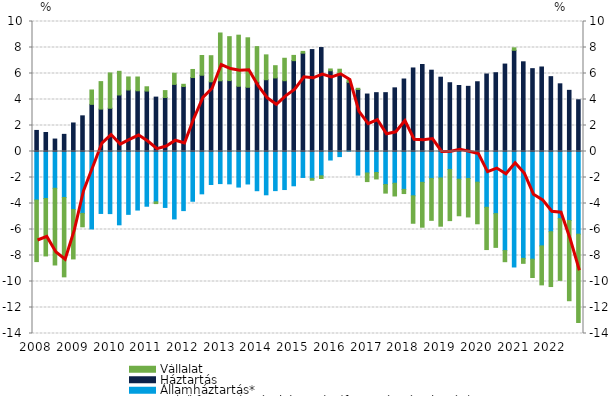
| Category | Államháztartás* | Háztartás | Vállalat |
|---|---|---|---|
| 2008.0 | -3.735 | 1.621 | -4.733 |
| nan | -3.615 | 1.462 | -4.419 |
| nan | -2.831 | 0.957 | -5.899 |
| nan | -3.539 | 1.319 | -6.103 |
| 2009.0 | -4.467 | 2.194 | -3.797 |
| nan | -4.761 | 2.743 | -1.033 |
| nan | -5.958 | 3.627 | 1.105 |
| nan | -4.765 | 3.261 | 2.114 |
| 2010.0 | -4.778 | 3.327 | 2.716 |
| nan | -5.641 | 4.347 | 1.821 |
| nan | -4.835 | 4.73 | 1.004 |
| nan | -4.504 | 4.67 | 1.06 |
| 2011.0 | -4.21 | 4.649 | 0.33 |
| nan | -3.873 | 4.184 | -0.134 |
| nan | -4.302 | 4.155 | 0.529 |
| nan | -5.187 | 5.162 | 0.856 |
| 2012.0 | -4.547 | 4.998 | 0.172 |
| nan | -3.828 | 5.689 | 0.621 |
| nan | -3.257 | 5.868 | 1.516 |
| nan | -2.538 | 5.362 | 2.007 |
| 2013.0 | -2.468 | 5.44 | 3.676 |
| nan | -2.49 | 5.455 | 3.379 |
| nan | -2.736 | 5.016 | 3.932 |
| nan | -2.498 | 4.941 | 3.806 |
| 2014.0 | -3.016 | 5.338 | 2.731 |
| nan | -3.33 | 5.521 | 1.912 |
| nan | -3.009 | 5.659 | 0.941 |
| nan | -2.926 | 5.446 | 1.727 |
| 2015.0 | -2.638 | 6.988 | 0.404 |
| nan | -1.997 | 7.564 | 0.135 |
| nan | -2.069 | 7.841 | -0.142 |
| nan | -1.87 | 7.997 | -0.209 |
| 2016.0 | -0.655 | 6.211 | 0.139 |
| nan | -0.393 | 5.984 | 0.345 |
| nan | 0.088 | 5.236 | 0.174 |
| nan | -1.815 | 4.773 | 0.089 |
| 2017.0 | -1.653 | 4.421 | -0.662 |
| nan | -1.614 | 4.525 | -0.497 |
| nan | -2.541 | 4.526 | -0.659 |
| nan | -2.444 | 4.896 | -0.976 |
| 2018.0 | -2.914 | 5.576 | -0.321 |
| nan | -3.41 | 6.426 | -2.11 |
| nan | -2.373 | 6.694 | -3.45 |
| nan | -2.072 | 6.254 | -3.222 |
| 2019.0 | -2.035 | 5.716 | -3.711 |
| nan | -1.38 | 5.291 | -3.936 |
| nan | -2.131 | 5.076 | -2.811 |
| nan | -2.073 | 5.012 | -2.962 |
| 2020.0 | -2.36 | 5.365 | -3.2 |
| nan | -4.292 | 5.962 | -3.251 |
| nan | -4.779 | 6.06 | -2.596 |
| nan | -7.62 | 6.725 | -0.856 |
| 2021.0 | -8.883 | 7.785 | 0.191 |
| nan | -8.22 | 6.9 | -0.383 |
| nan | -8.284 | 6.372 | -1.41 |
| nan | -7.262 | 6.5 | -2.998 |
| 2022.0 | -6.171 | 5.757 | -4.217 |
| nan | -5.166 | 5.206 | -4.748 |
| nan | -5.311 | 4.704 | -6.168 |
| nan | -6.361 | 3.977 | -6.792 |